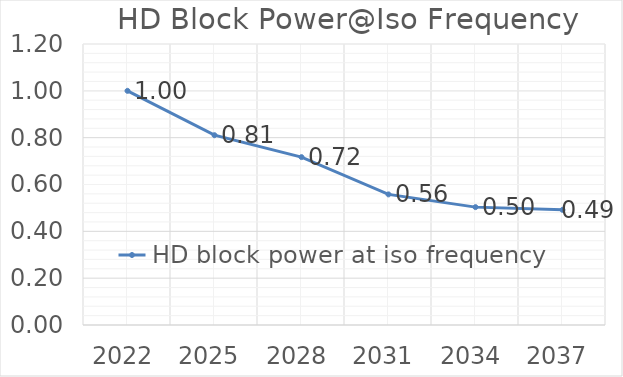
| Category | HD block power at iso frequency |
|---|---|
| 2022.0 | 1 |
| 2025.0 | 0.81 |
| 2028.0 | 0.717 |
| 2031.0 | 0.558 |
| 2034.0 | 0.503 |
| 2037.0 | 0.492 |